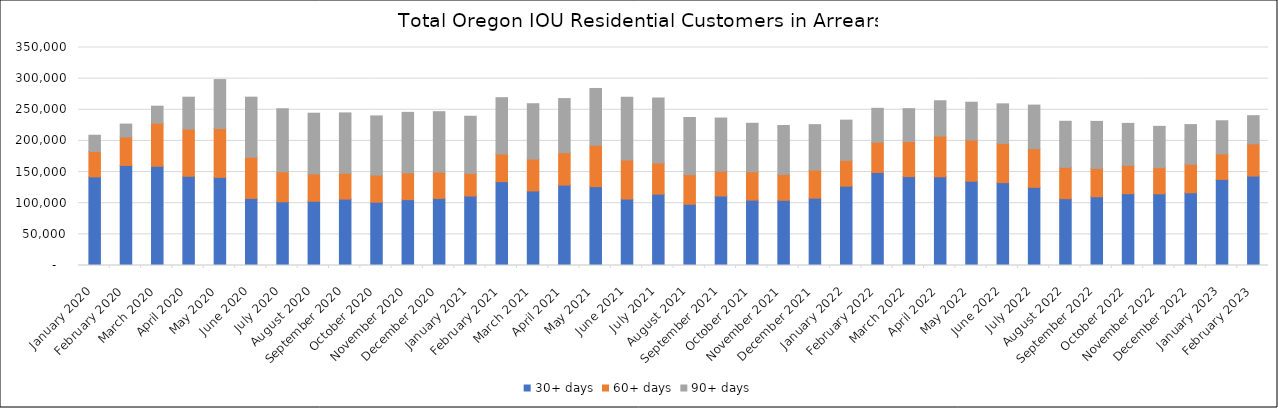
| Category | 30+ days | 60+ days | 90+ days |
|---|---|---|---|
| 2020-01-01 | 142268 | 40781 | 26095 |
| 2020-02-01 | 160636 | 45689 | 20711 |
| 2020-03-01 | 159304 | 69159 | 27326 |
| 2020-04-01 | 143243 | 75684 | 51299 |
| 2020-05-01 | 141411 | 78536 | 78540 |
| 2020-06-01 | 107720 | 66159 | 96392 |
| 2020-07-01 | 102245 | 48111 | 101451 |
| 2020-08-01 | 103115 | 43850 | 97534 |
| 2020-09-01 | 106622 | 41501 | 96849 |
| 2020-10-01 | 101580 | 43520 | 95067 |
| 2020-11-01 | 105746 | 42862 | 97255 |
| 2020-12-01 | 107693 | 42134 | 97115 |
| 2021-01-01 | 111529 | 36282 | 91788 |
| 2021-02-01 | 134617 | 44390 | 90433 |
| 2021-03-01 | 119652 | 51153 | 88908 |
| 2021-04-01 | 129044 | 52006 | 86944 |
| 2021-05-01 | 126634 | 66400 | 91211 |
| 2021-06-01 | 106680 | 62614 | 100842 |
| 2021-07-01 | 114547 | 50074 | 104454 |
| 2021-08-01 | 98324 | 47540 | 91759 |
| 2021-09-01 | 111545 | 39916 | 85267 |
| 2021-10-01 | 104997 | 45544 | 77760 |
| 2021-11-01 | 104675 | 41582 | 78510 |
| 2021-12-01 | 108121 | 45089 | 72915 |
| 2022-01-01 | 127360 | 41421 | 64567 |
| 2022-02-01 | 149271 | 48615 | 54449 |
| 2022-03-01 | 142755 | 56236 | 52846 |
| 2022-04-01 | 142393 | 65456 | 56670 |
| 2022-05-01 | 135257 | 66163 | 60738 |
| 2022-06-01 | 133031 | 62956 | 63532 |
| 2022-07-01 | 125491 | 62137 | 69907 |
| 2022-08-01 | 107279 | 50229 | 74036 |
| 2022-09-01 | 110380 | 45497 | 75506 |
| 2022-10-01 | 115252 | 45447 | 67449 |
| 2022-11-01 | 115101 | 42018 | 66267 |
| 2022-12-01 | 116765 | 45763 | 63686 |
| 2023-01-01 | 138189 | 41058 | 53119 |
| 2023-02-01 | 143603 | 51717 | 45218 |